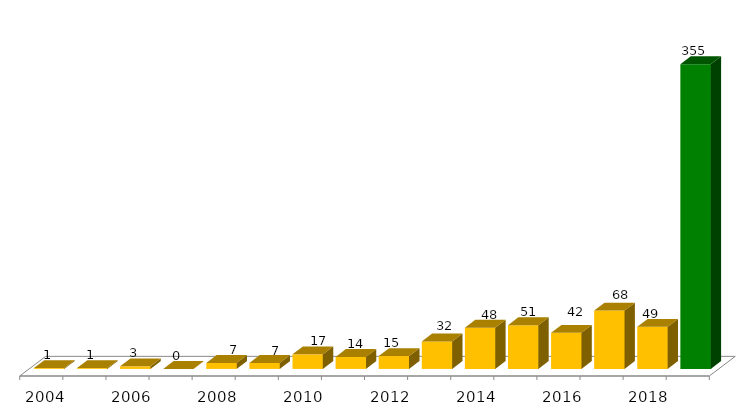
| Category | Categoria/Ano |
|---|---|
| 2004 | 1 |
| 2005 | 1 |
| 2006 | 3 |
| 2007 | 0 |
| 2008 | 7 |
| 2009 | 7 |
| 2010 | 17 |
| 2011 | 14 |
| 2012 | 15 |
| 2013 | 32 |
| 2014 | 48 |
| 2015 | 51 |
| 2016 | 42 |
| 2017 | 68 |
| 2018 | 49 |
| Total Geral | 355 |